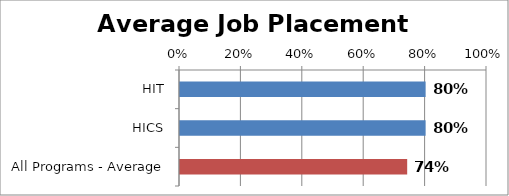
| Category | Series 0 |
|---|---|
| HIT | 0.8 |
| HICS | 0.8 |
| All Programs - Average | 0.74 |